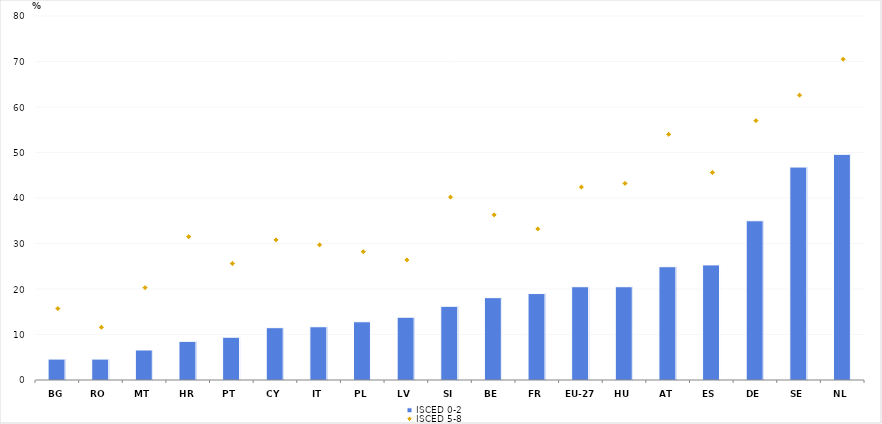
| Category | ISCED 0-2 |
|---|---|
| BG | 4.6 |
| RO | 4.6 |
| MT | 6.6 |
| HR | 8.5 |
| PT | 9.4 |
| CY | 11.5 |
| IT | 11.7 |
| PL | 12.8 |
| LV | 13.8 |
| SI | 16.2 |
| BE | 18.1 |
| FR | 19 |
| EU-27 | 20.5 |
| HU | 20.5 |
| AT | 24.9 |
| ES | 25.3 |
| DE | 35 |
| SE | 46.8 |
| NL | 49.6 |